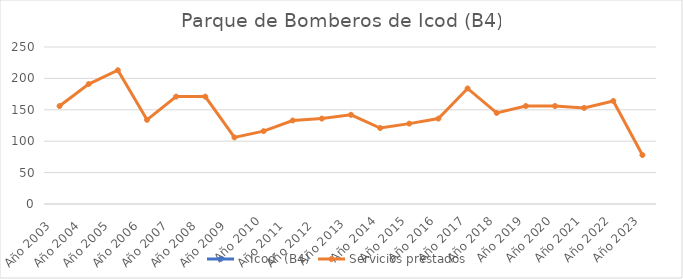
| Category |    Icod  (B4) | Servicios prestados  |
|---|---|---|
| Año 2003   |  | 156 |
| Año 2004   |  | 191 |
| Año 2005   |  | 213 |
| Año 2006   |  | 134 |
| Año 2007   |  | 171 |
| Año 2008   |  | 171 |
| Año 2009   |  | 106 |
| Año 2010 |  | 116 |
| Año 2011   |  | 133 |
| Año 2012   |  | 136 |
| Año 2013  |  | 142 |
| Año 2014 |  | 121 |
| Año 2015 |  | 128 |
| Año 2016 |  | 136 |
| Año 2017 |  | 184 |
| Año 2018 |  | 145 |
| Año 2019 |  | 156 |
| Año 2020 |  | 156 |
| Año 2021 |  | 153 |
| Año 2022 |  | 164 |
| Año 2023 |  | 78 |